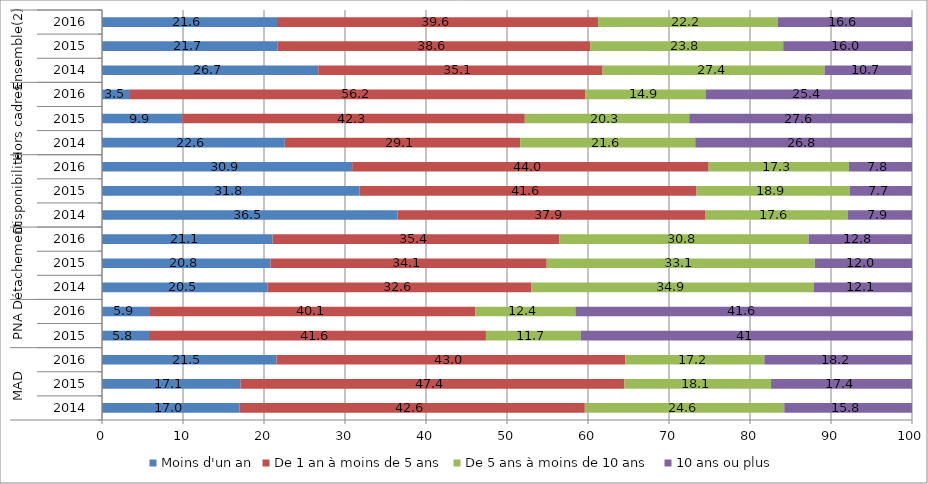
| Category | Moins d'un an | De 1 an à moins de 5 ans | De 5 ans à moins de 10 ans  | 10 ans ou plus |
|---|---|---|---|---|
| 0 | 16.963 | 42.645 | 24.622 | 15.77 |
| 1 | 17.1 | 47.4 | 18.1 | 17.4 |
| 2 | 21.549 | 43.042 | 17.183 | 18.225 |
| 3 | 5.8 | 41.6 | 11.7 | 41 |
| 4 | 5.925 | 40.14 | 12.382 | 41.553 |
| 5 | 20.463 | 32.562 | 34.878 | 12.097 |
| 6 | 20.8 | 34.1 | 33.1 | 12 |
| 7 | 21.066 | 35.411 | 30.759 | 12.764 |
| 8 | 36.499 | 37.945 | 17.618 | 7.938 |
| 9 | 31.8 | 41.6 | 18.9 | 7.7 |
| 10 | 30.883 | 44.012 | 17.311 | 7.795 |
| 11 | 22.568 | 29.054 | 21.622 | 26.757 |
| 12 | 9.9 | 42.3 | 20.3 | 27.6 |
| 13 | 3.454 | 56.201 | 14.914 | 25.432 |
| 14 | 26.7 | 35.1 | 27.407 | 10.726 |
| 15 | 21.7 | 38.6 | 23.8 | 16 |
| 16 | 21.603 | 39.649 | 22.166 | 16.582 |